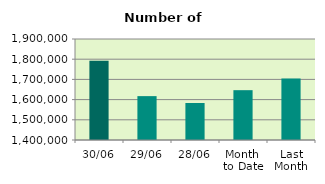
| Category | Series 0 |
|---|---|
| 30/06 | 1792482 |
| 29/06 | 1617190 |
| 28/06 | 1583300 |
| Month 
to Date | 1646651.818 |
| Last
Month | 1704183.545 |